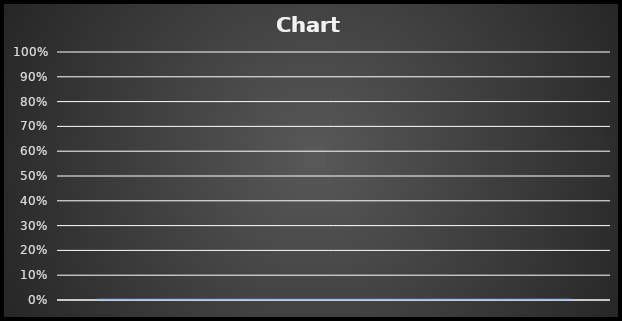
| Category | Sleep Efficiency for Week 4 | Goal |
|---|---|---|
|  | 0 |  |
|  | 0 |  |
|  | 0 |  |
|  | 0 |  |
|  | 0 |  |
|  | 0 |  |
|  | 0 |  |